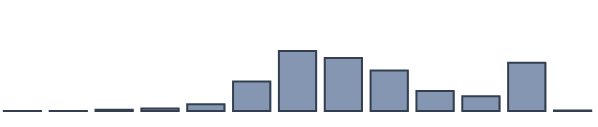
| Category | Series 0 |
|---|---|
| 0 | 0.033 |
| 1 | 0.045 |
| 2 | 0.423 |
| 3 | 0.921 |
| 4 | 2.471 |
| 5 | 10.605 |
| 6 | 21.634 |
| 7 | 19.14 |
| 8 | 14.635 |
| 9 | 7.201 |
| 10 | 5.34 |
| 11 | 17.382 |
| 12 | 0.169 |